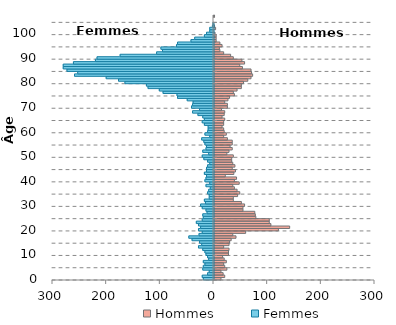
| Category | Hommes | Femmes |
|---|---|---|
| 0.0 | 13 | -19 |
| 1.0 | 20 | -21 |
| 2.0 | 17 | -11 |
| 3.0 | 13 | -8 |
| 4.0 | 24 | -20 |
| 5.0 | 20 | -19 |
| 6.0 | 18 | -16 |
| 7.0 | 23 | -19 |
| 8.0 | 19 | -9 |
| 9.0 | 16 | -11 |
| 10.0 | 27 | -14 |
| 11.0 | 27 | -16 |
| 12.0 | 28 | -20 |
| 13.0 | 18 | -28 |
| 14.0 | 28 | -22 |
| 15.0 | 29 | -26 |
| 16.0 | 32 | -40 |
| 17.0 | 41 | -46 |
| 18.0 | 35 | -27 |
| 19.0 | 59 | -21 |
| 20.0 | 120 | -28 |
| 21.0 | 141 | -24 |
| 22.0 | 106 | -28 |
| 23.0 | 103 | -32 |
| 24.0 | 103 | -21 |
| 25.0 | 78 | -19 |
| 26.0 | 77 | -20 |
| 27.0 | 76 | -12 |
| 28.0 | 54 | -14 |
| 29.0 | 54 | -21 |
| 30.0 | 57 | -24 |
| 31.0 | 51 | -15 |
| 32.0 | 36 | -17 |
| 33.0 | 36 | -8 |
| 34.0 | 44 | -8 |
| 35.0 | 48 | -11 |
| 36.0 | 43 | -9 |
| 37.0 | 38 | -6 |
| 38.0 | 35 | -14 |
| 39.0 | 47 | -7 |
| 40.0 | 38 | -16 |
| 41.0 | 42 | -14 |
| 42.0 | 21 | -13 |
| 43.0 | 37 | -17 |
| 44.0 | 40 | -13 |
| 45.0 | 34 | -13 |
| 46.0 | 39 | -11 |
| 47.0 | 35 | -7 |
| 48.0 | 33 | -11 |
| 49.0 | 33 | -18 |
| 50.0 | 36 | -21 |
| 51.0 | 24 | -9 |
| 52.0 | 28 | -20 |
| 53.0 | 34 | -14 |
| 54.0 | 30 | -13 |
| 55.0 | 34 | -16 |
| 56.0 | 34 | -18 |
| 57.0 | 25 | -22 |
| 58.0 | 18 | -7 |
| 59.0 | 23 | -16 |
| 60.0 | 19 | -11 |
| 61.0 | 18 | -10 |
| 62.0 | 15 | -10 |
| 63.0 | 18 | -17 |
| 64.0 | 18 | -21 |
| 65.0 | 20 | -17 |
| 66.0 | 15 | -20 |
| 67.0 | 19 | -29 |
| 68.0 | 20 | -39 |
| 69.0 | 14 | -26 |
| 70.0 | 25 | -41 |
| 71.0 | 25 | -39 |
| 72.0 | 20 | -38 |
| 73.0 | 26 | -49 |
| 74.0 | 29 | -67 |
| 75.0 | 38 | -68 |
| 76.0 | 36 | -94 |
| 77.0 | 43 | -101 |
| 78.0 | 51 | -122 |
| 79.0 | 51 | -125 |
| 80.0 | 55 | -165 |
| 81.0 | 63 | -177 |
| 82.0 | 69 | -200 |
| 83.0 | 72 | -259 |
| 84.0 | 70 | -253 |
| 85.0 | 69 | -273 |
| 86.0 | 53 | -280 |
| 87.0 | 48 | -280 |
| 88.0 | 57 | -261 |
| 89.0 | 52 | -220 |
| 90.0 | 36 | -217 |
| 91.0 | 31 | -174 |
| 92.0 | 18 | -106 |
| 93.0 | 11 | -95 |
| 94.0 | 10 | -98 |
| 95.0 | 15 | -69 |
| 96.0 | 11 | -67 |
| 97.0 | 4 | -42 |
| 98.0 | 4 | -35 |
| 99.0 | 4 | -17 |
| 100.0 | 2 | -13 |
| 101.0 | 0 | -7 |
| 102.0 | 3 | -7 |
| 103.0 | 1 | -2 |
| 104.0 | 0 | -1 |
| 105.0 | 0 | 0 |
| 106.0 | 0 | 0 |
| 107.0 | 1 | 0 |